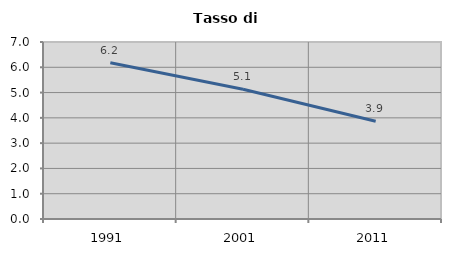
| Category | Tasso di disoccupazione   |
|---|---|
| 1991.0 | 6.18 |
| 2001.0 | 5.128 |
| 2011.0 | 3.863 |